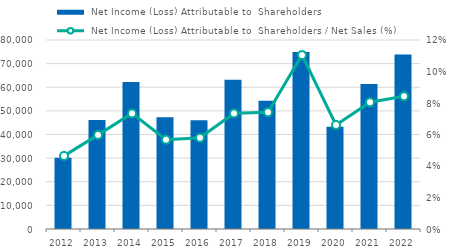
| Category |  Net Income (Loss) Attributable to  Shareholders |
|---|---|
| 2012.0 | 30203 |
| 2013.0 | 46185 |
| 2014.0 | 62170 |
| 2015.0 | 47290 |
| 2016.0 | 45987 |
| 2017.0 | 63159 |
| 2018.0 | 54323 |
| 2019.0 | 74895 |
| 2020.0 | 43307 |
| 2021.0 | 61400 |
| 2022.0 | 73861 |